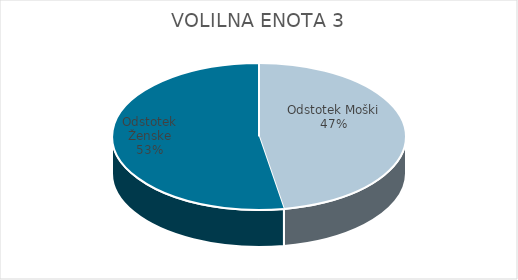
| Category | VOLILNA ENOTA 3 | #REF! | Slovenija skupaj |
|---|---|---|---|
| Odstotek Moški | 34.63 |  | 33.67 |
| Odstotek Ženske | 38.6 |  | 35.97 |